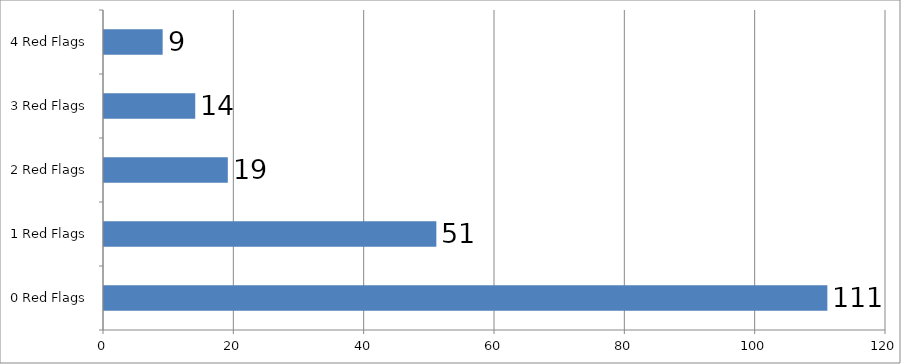
| Category | Series 0 |
|---|---|
| 0 Red Flags | 111 |
| 1 Red Flags | 51 |
| 2 Red Flags | 19 |
| 3 Red Flags | 14 |
| 4 Red Flags | 9 |